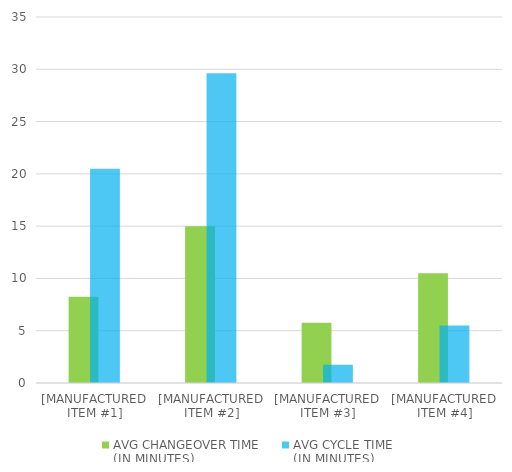
| Category | AVG CHANGEOVER TIME 
(IN MINUTES) | AVG CYCLE TIME 
(IN MINUTES) |
|---|---|---|
| [MANUFACTURED ITEM #1] | 8.25 | 20.5 |
| [MANUFACTURED ITEM #2] | 15 | 29.625 |
| [MANUFACTURED ITEM #3] | 5.75 | 1.75 |
| [MANUFACTURED ITEM #4] | 10.5 | 5.5 |